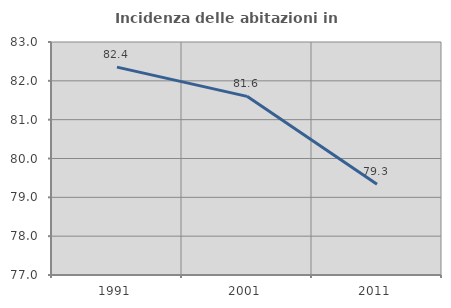
| Category | Incidenza delle abitazioni in proprietà  |
|---|---|
| 1991.0 | 82.353 |
| 2001.0 | 81.6 |
| 2011.0 | 79.339 |